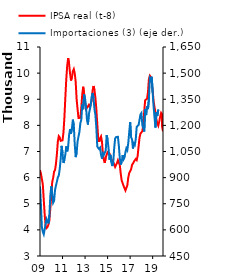
| Category | IPSA real (t-8) |
|---|---|
| 2009-01-01 | 6287.022 |
| 2009-02-01 | 6151.582 |
| 2009-03-01 | 5948.466 |
| 2009-04-01 | 5738.518 |
| 2009-05-01 | 5153.55 |
| 2009-06-01 | 4583.989 |
| 2009-07-01 | 4142.282 |
| 2009-08-01 | 4069.826 |
| 2009-09-01 | 4112.106 |
| 2009-10-01 | 4203.062 |
| 2009-11-01 | 4363.008 |
| 2009-12-01 | 4834.722 |
| 2010-01-01 | 5306.34 |
| 2010-02-01 | 5828.219 |
| 2010-03-01 | 5987.686 |
| 2010-04-01 | 6227.871 |
| 2010-05-01 | 6289.473 |
| 2010-06-01 | 6527.153 |
| 2010-07-01 | 6905.02 |
| 2010-08-01 | 7378.005 |
| 2010-09-01 | 7587.483 |
| 2010-10-01 | 7541.768 |
| 2010-11-01 | 7406.779 |
| 2010-12-01 | 7371.16 |
| 2011-01-01 | 7428.582 |
| 2011-02-01 | 7731.826 |
| 2011-03-01 | 8309.115 |
| 2011-04-01 | 9070.212 |
| 2011-05-01 | 9775.894 |
| 2011-06-01 | 10296.612 |
| 2011-07-01 | 10573.12 |
| 2011-08-01 | 10341.643 |
| 2011-09-01 | 9996.482 |
| 2011-10-01 | 9718.052 |
| 2011-11-01 | 9837.695 |
| 2011-12-01 | 10070.707 |
| 2012-01-01 | 10153.092 |
| 2012-02-01 | 9995.833 |
| 2012-03-01 | 9669.151 |
| 2012-04-01 | 9005.826 |
| 2012-05-01 | 8627.168 |
| 2012-06-01 | 8283.151 |
| 2012-07-01 | 8289.119 |
| 2012-08-01 | 8288.803 |
| 2012-09-01 | 8686.838 |
| 2012-10-01 | 9188.655 |
| 2012-11-01 | 9478.112 |
| 2012-12-01 | 9212.256 |
| 2013-01-01 | 8883.519 |
| 2013-02-01 | 8626.848 |
| 2013-03-01 | 8633.52 |
| 2013-04-01 | 8724.192 |
| 2013-05-01 | 8780.042 |
| 2013-06-01 | 8703.181 |
| 2013-07-01 | 8667.69 |
| 2013-08-01 | 8938.778 |
| 2013-09-01 | 9333.665 |
| 2013-10-01 | 9508.467 |
| 2013-11-01 | 9345.507 |
| 2013-12-01 | 9058.867 |
| 2014-01-01 | 8619.618 |
| 2014-02-01 | 8057.688 |
| 2014-03-01 | 7508.561 |
| 2014-04-01 | 7368.504 |
| 2014-05-01 | 7506.048 |
| 2014-06-01 | 7576.082 |
| 2014-07-01 | 7375.702 |
| 2014-08-01 | 6891.313 |
| 2014-09-01 | 6679.428 |
| 2014-10-01 | 6565.599 |
| 2014-11-01 | 6774.711 |
| 2014-12-01 | 6876.59 |
| 2015-01-01 | 6977.035 |
| 2015-02-01 | 6955.4 |
| 2015-03-01 | 6926.919 |
| 2015-04-01 | 6819.831 |
| 2015-05-01 | 6710.741 |
| 2015-06-01 | 6686.12 |
| 2015-07-01 | 6593.711 |
| 2015-08-01 | 6500.085 |
| 2015-09-01 | 6406.763 |
| 2015-10-01 | 6413.601 |
| 2015-11-01 | 6560.295 |
| 2015-12-01 | 6663.416 |
| 2016-01-01 | 6657.777 |
| 2016-02-01 | 6481.583 |
| 2016-03-01 | 6147.694 |
| 2016-04-01 | 5887.333 |
| 2016-05-01 | 5791.548 |
| 2016-06-01 | 5686.062 |
| 2016-07-01 | 5680.948 |
| 2016-08-01 | 5508.001 |
| 2016-09-01 | 5525.648 |
| 2016-10-01 | 5705.997 |
| 2016-11-01 | 6000.809 |
| 2016-12-01 | 6173.082 |
| 2017-01-01 | 6204.757 |
| 2017-02-01 | 6311.665 |
| 2017-03-01 | 6486.755 |
| 2017-04-01 | 6540.678 |
| 2017-05-01 | 6612.127 |
| 2017-06-01 | 6635.74 |
| 2017-07-01 | 6713.383 |
| 2017-08-01 | 6673.413 |
| 2017-09-01 | 6835.527 |
| 2017-10-01 | 7191.811 |
| 2017-11-01 | 7528.356 |
| 2017-12-01 | 7685.289 |
| 2018-01-01 | 7648.086 |
| 2018-02-01 | 7778.215 |
| 2018-03-01 | 8044.151 |
| 2018-04-01 | 8533.622 |
| 2018-05-01 | 8962.403 |
| 2018-06-01 | 8937.111 |
| 2018-07-01 | 9019.056 |
| 2018-08-01 | 9271.047 |
| 2018-09-01 | 9771.135 |
| 2018-10-01 | 9902.26 |
| 2018-11-01 | 9851.258 |
| 2018-12-01 | 9619.39 |
| 2019-01-01 | 9325.621 |
| 2019-02-01 | 8920.082 |
| 2019-03-01 | 8689.203 |
| 2019-04-01 | 8495.786 |
| 2019-05-01 | 8230.476 |
| 2019-06-01 | 8071.28 |
| 2019-07-01 | 7987.304 |
| 2019-08-01 | 8148.527 |
| 2019-09-01 | 8334.581 |
| 2019-10-01 | 8477.528 |
| 2019-11-01 | 8423.363 |
| 2019-11-02 | 8136.384 |
| 2019-11-03 | 7959.774 |
| 2019-12-01 | 7772.49 |